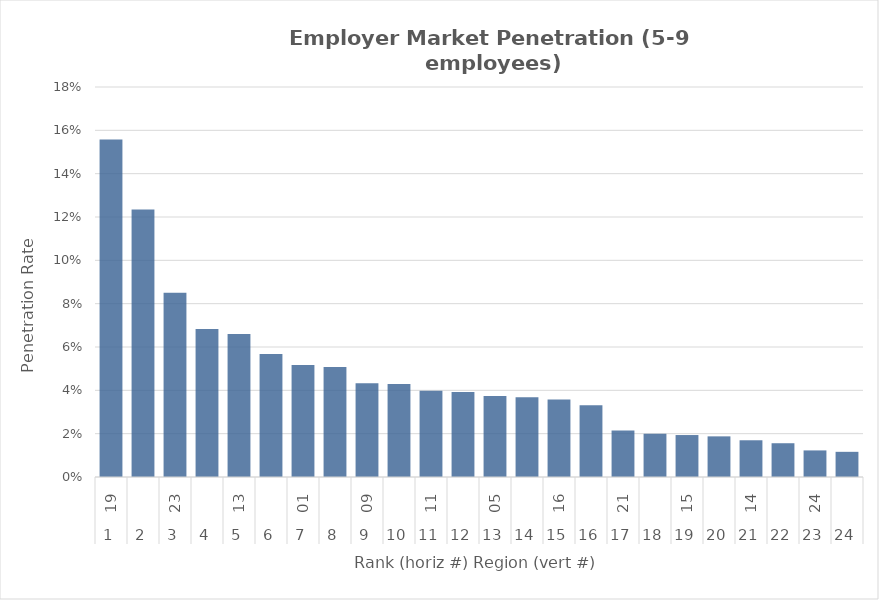
| Category | Rate |
|---|---|
| 0 | 0.156 |
| 1 | 0.123 |
| 2 | 0.085 |
| 3 | 0.068 |
| 4 | 0.066 |
| 5 | 0.057 |
| 6 | 0.052 |
| 7 | 0.051 |
| 8 | 0.043 |
| 9 | 0.043 |
| 10 | 0.04 |
| 11 | 0.039 |
| 12 | 0.037 |
| 13 | 0.037 |
| 14 | 0.036 |
| 15 | 0.033 |
| 16 | 0.021 |
| 17 | 0.02 |
| 18 | 0.019 |
| 19 | 0.019 |
| 20 | 0.017 |
| 21 | 0.016 |
| 22 | 0.012 |
| 23 | 0.012 |